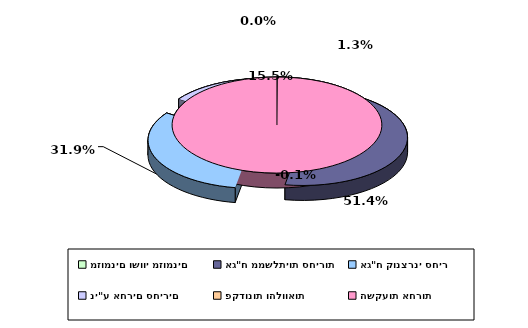
| Category | Series 0 |
|---|---|
| מזומנים ושווי מזומנים | 0.013 |
| אג"ח ממשלתיות סחירות | 0.514 |
| אג"ח קונצרני סחיר | 0.319 |
| ני"ע אחרים סחירים | 0.155 |
| פקדונות והלוואות | 0 |
| השקעות אחרות | -0.001 |